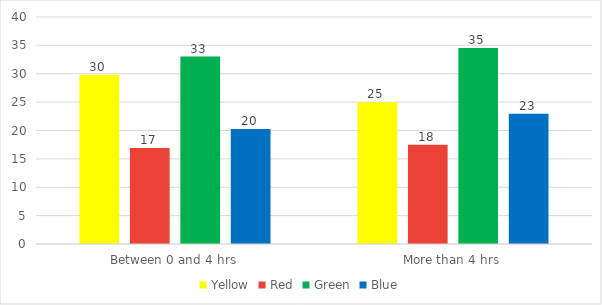
| Category | Yellow | Red | Green | Blue |
|---|---|---|---|---|
| Between 0 and 4 hrs | 29.833 | 16.895 | 33.029 | 20.244 |
| More than 4 hrs | 25 | 17.5 | 34.545 | 22.955 |